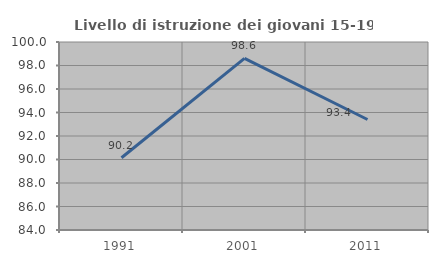
| Category | Livello di istruzione dei giovani 15-19 anni |
|---|---|
| 1991.0 | 90.152 |
| 2001.0 | 98.611 |
| 2011.0 | 93.407 |